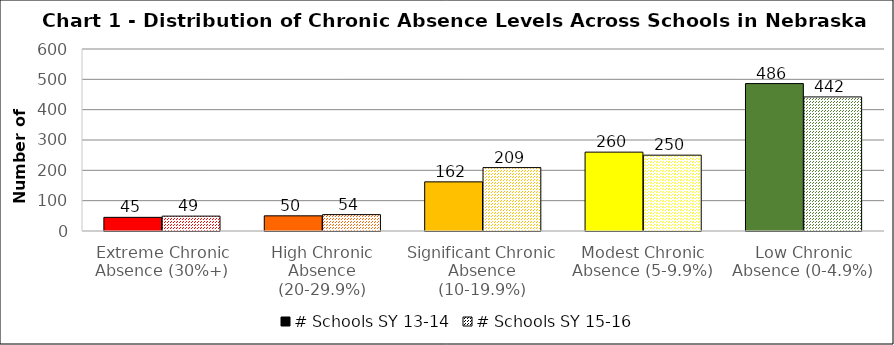
| Category | # Schools SY 13-14 | # Schools SY 15-16 |
|---|---|---|
| Extreme Chronic Absence (30%+) | 45 | 49 |
| High Chronic Absence (20-29.9%) | 50 | 54 |
| Significant Chronic Absence (10-19.9%) | 162 | 209 |
| Modest Chronic Absence (5-9.9%) | 260 | 250 |
| Low Chronic Absence (0-4.9%) | 486 | 442 |